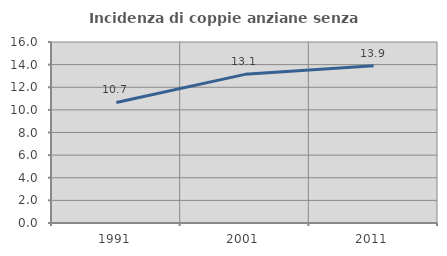
| Category | Incidenza di coppie anziane senza figli  |
|---|---|
| 1991.0 | 10.652 |
| 2001.0 | 13.141 |
| 2011.0 | 13.911 |